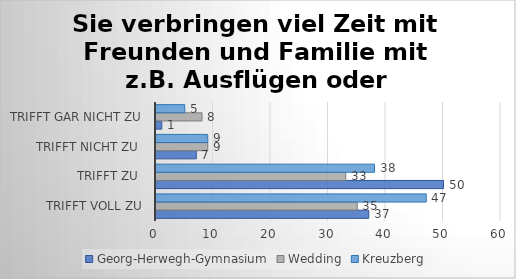
| Category | Georg-Herwegh-Gymnasium | Wedding | Kreuzberg |
|---|---|---|---|
| trifft voll zu | 37 | 35 | 47 |
| trifft zu  | 50 | 33 | 38 |
| trifft nicht zu  | 7 | 9 | 9 |
| trifft gar nicht zu | 1 | 8 | 5 |